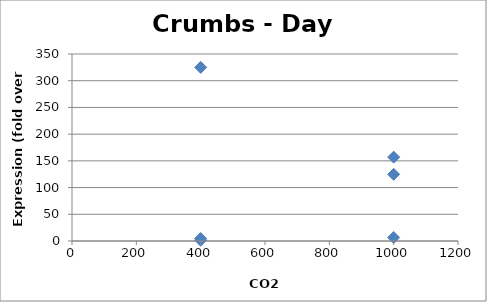
| Category | Series 0 |
|---|---|
| 1000.0 | 6.53 |
| 1000.0 | 156.937 |
| 1000.0 | 124.784 |
| 400.0 | 4.643 |
| 400.0 | 324.954 |
| 400.0 | 1.425 |